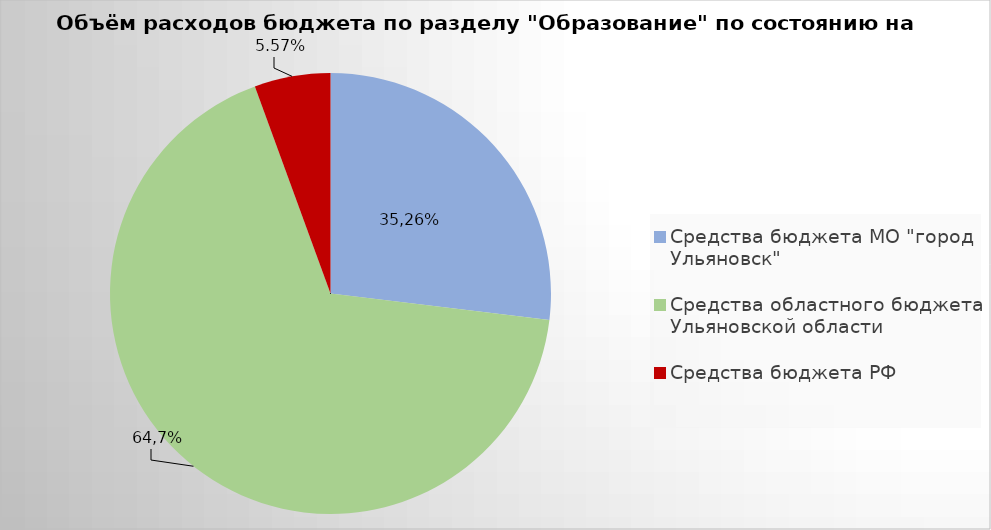
| Category | Series 0 |
|---|---|
| Средства бюджета МО "город Ульяновск" | 2073553.6 |
| Средства областного бюджета Ульяновской области | 5201116.08 |
| Средства бюджета РФ | 429251.76 |